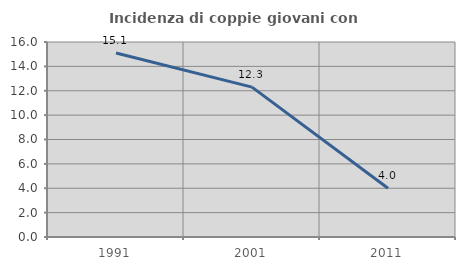
| Category | Incidenza di coppie giovani con figli |
|---|---|
| 1991.0 | 15.094 |
| 2001.0 | 12.295 |
| 2011.0 | 4 |